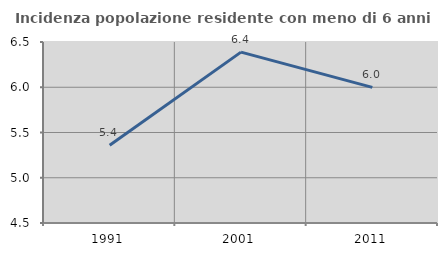
| Category | Incidenza popolazione residente con meno di 6 anni |
|---|---|
| 1991.0 | 5.36 |
| 2001.0 | 6.388 |
| 2011.0 | 5.998 |